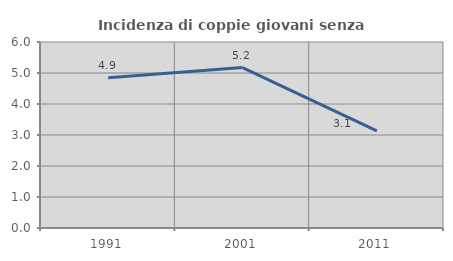
| Category | Incidenza di coppie giovani senza figli |
|---|---|
| 1991.0 | 4.85 |
| 2001.0 | 5.176 |
| 2011.0 | 3.134 |